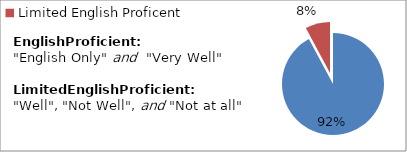
| Category | Percent |
|---|---|
| English Proficient | 0.922 |
| Limited English Proficent | 0.078 |